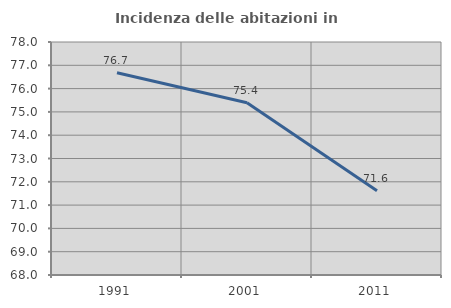
| Category | Incidenza delle abitazioni in proprietà  |
|---|---|
| 1991.0 | 76.684 |
| 2001.0 | 75.39 |
| 2011.0 | 71.617 |